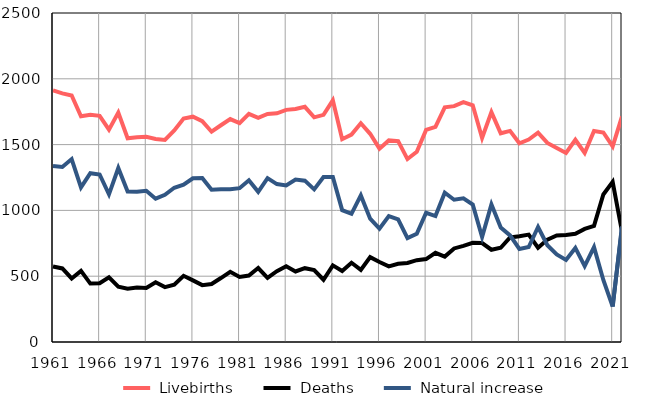
| Category |  Livebirths |  Deaths |  Natural increase |
|---|---|---|---|
| 1961.0 | 1912 | 574 | 1338 |
| 1962.0 | 1889 | 559 | 1330 |
| 1963.0 | 1873 | 483 | 1390 |
| 1964.0 | 1715 | 540 | 1175 |
| 1965.0 | 1727 | 444 | 1283 |
| 1966.0 | 1719 | 446 | 1273 |
| 1967.0 | 1613 | 491 | 1122 |
| 1968.0 | 1743 | 421 | 1322 |
| 1969.0 | 1548 | 405 | 1143 |
| 1970.0 | 1556 | 414 | 1142 |
| 1971.0 | 1559 | 410 | 1149 |
| 1972.0 | 1543 | 454 | 1089 |
| 1973.0 | 1535 | 417 | 1118 |
| 1974.0 | 1607 | 435 | 1172 |
| 1975.0 | 1698 | 503 | 1195 |
| 1976.0 | 1712 | 468 | 1244 |
| 1977.0 | 1678 | 432 | 1246 |
| 1978.0 | 1598 | 441 | 1157 |
| 1979.0 | 1647 | 486 | 1161 |
| 1980.0 | 1694 | 534 | 1160 |
| 1981.0 | 1663 | 494 | 1169 |
| 1982.0 | 1734 | 505 | 1229 |
| 1983.0 | 1703 | 562 | 1141 |
| 1984.0 | 1733 | 488 | 1245 |
| 1985.0 | 1738 | 538 | 1200 |
| 1986.0 | 1764 | 575 | 1189 |
| 1987.0 | 1771 | 536 | 1235 |
| 1988.0 | 1787 | 561 | 1226 |
| 1989.0 | 1707 | 547 | 1160 |
| 1990.0 | 1726 | 473 | 1253 |
| 1991.0 | 1836 | 582 | 1254 |
| 1992.0 | 1541 | 539 | 1002 |
| 1993.0 | 1576 | 602 | 974 |
| 1994.0 | 1662 | 548 | 1114 |
| 1995.0 | 1582 | 645 | 937 |
| 1996.0 | 1469 | 608 | 861 |
| 1997.0 | 1532 | 575 | 957 |
| 1998.0 | 1526 | 594 | 932 |
| 1999.0 | 1390 | 601 | 789 |
| 2000.0 | 1445 | 622 | 823 |
| 2001.0 | 1612 | 630 | 982 |
| 2002.0 | 1635 | 678 | 957 |
| 2003.0 | 1783 | 649 | 1134 |
| 2004.0 | 1792 | 711 | 1081 |
| 2005.0 | 1823 | 731 | 1092 |
| 2006.0 | 1799 | 754 | 1045 |
| 2007.0 | 1550 | 752 | 798 |
| 2008.0 | 1747 | 701 | 1046 |
| 2009.0 | 1586 | 716 | 870 |
| 2010.0 | 1604 | 794 | 810 |
| 2011.0 | 1510 | 803 | 707 |
| 2012.0 | 1538 | 816 | 722 |
| 2013.0 | 1590 | 716 | 874 |
| 2014.0 | 1513 | 778 | 735 |
| 2015.0 | 1475 | 810 | 665 |
| 2016.0 | 1437 | 813 | 624 |
| 2017.0 | 1537 | 822 | 715 |
| 2018.0 | 1436 | 859 | 577 |
| 2019.0 | 1603 | 882 | 721 |
| 2020.0 | 1592 | 1121 | 471 |
| 2021.0 | 1486 | 1217 | 269 |
| 2022.0 | 1714 | 838 | 876 |